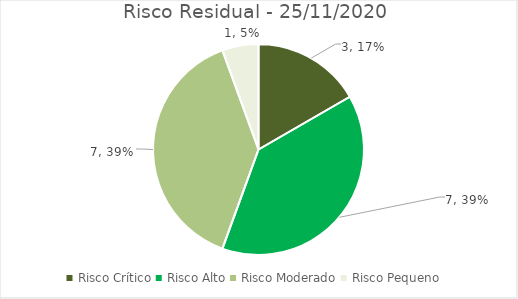
| Category | Series 0 |
|---|---|
| Risco Crítico | 3 |
| Risco Alto | 7 |
| Risco Moderado | 7 |
| Risco Pequeno | 1 |